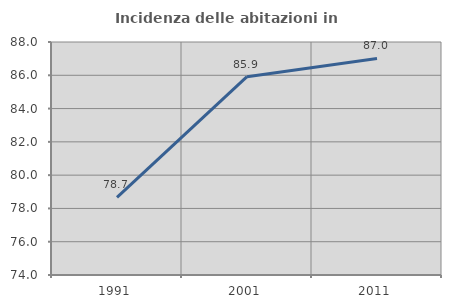
| Category | Incidenza delle abitazioni in proprietà  |
|---|---|
| 1991.0 | 78.668 |
| 2001.0 | 85.918 |
| 2011.0 | 87.01 |